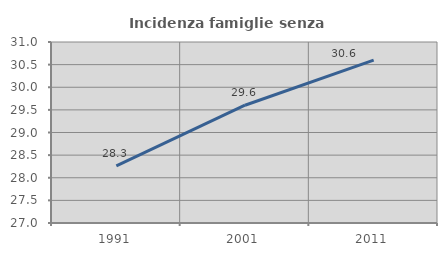
| Category | Incidenza famiglie senza nuclei |
|---|---|
| 1991.0 | 28.261 |
| 2001.0 | 29.603 |
| 2011.0 | 30.599 |